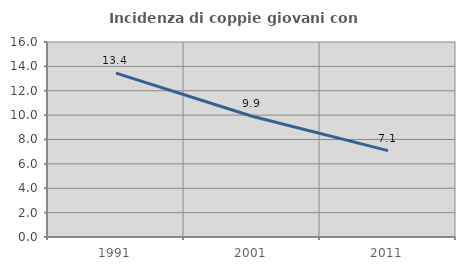
| Category | Incidenza di coppie giovani con figli |
|---|---|
| 1991.0 | 13.444 |
| 2001.0 | 9.91 |
| 2011.0 | 7.09 |